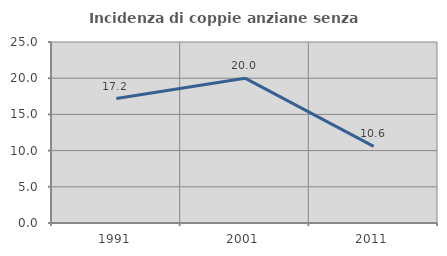
| Category | Incidenza di coppie anziane senza figli  |
|---|---|
| 1991.0 | 17.188 |
| 2001.0 | 20 |
| 2011.0 | 10.588 |